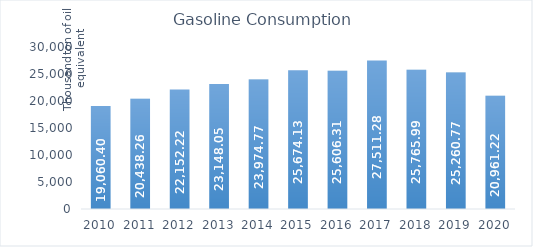
| Category | Gasoline Consumption |
|---|---|
| 2010.0 | 19060.4 |
| 2011.0 | 20438.26 |
| 2012.0 | 22152.22 |
| 2013.0 | 23148.05 |
| 2014.0 | 23974.77 |
| 2015.0 | 25674.13 |
| 2016.0 | 25606.31 |
| 2017.0 | 27511.28 |
| 2018.0 | 25765.99 |
| 2019.0 | 25260.77 |
| 2020.0 | 20961.22 |